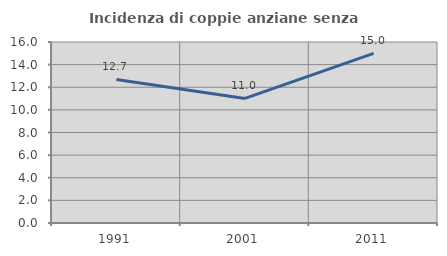
| Category | Incidenza di coppie anziane senza figli  |
|---|---|
| 1991.0 | 12.69 |
| 2001.0 | 11.013 |
| 2011.0 | 15 |